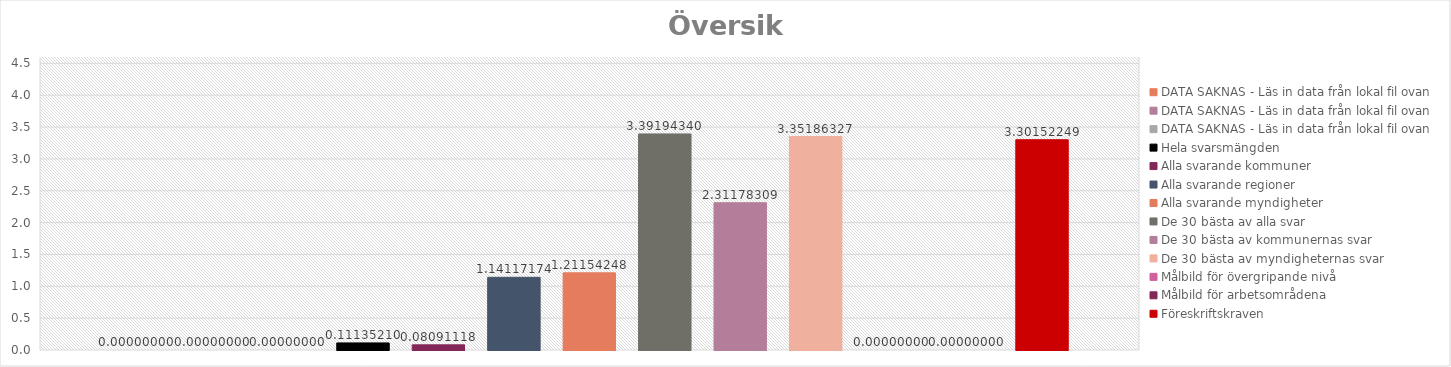
| Category | DATA SAKNAS - Läs in data från lokal fil ovan | Hela svarsmängden | Alla svarande kommuner | Alla svarande regioner | Alla svarande myndigheter | De 30 bästa av alla svar | De 30 bästa av kommunernas svar | De 30 bästa av myndigheternas svar | Målbild för övergripande nivå | Målbild för arbetsområdena | Föreskriftskraven |
|---|---|---|---|---|---|---|---|---|---|---|---|
| 0 | 0 | 0.111 | 0.081 | 1.141 | 1.212 | 3.392 | 2.312 | 3.352 | 0 | 0 | 3.302 |